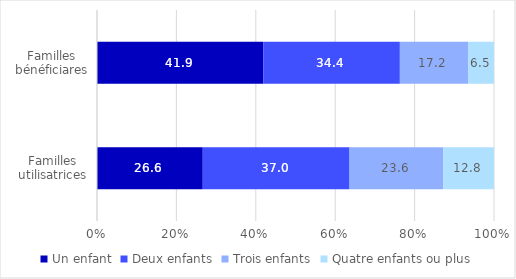
| Category | Un enfant | Deux enfants | Trois enfants | Quatre enfants ou plus |
|---|---|---|---|---|
| Familles utilisatrices | 26.644 | 36.977 | 23.57 | 12.81 |
| Familles bénéficiares | 41.863 | 34.426 | 17.185 | 6.525 |